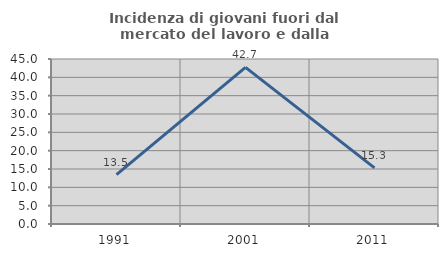
| Category | Incidenza di giovani fuori dal mercato del lavoro e dalla formazione  |
|---|---|
| 1991.0 | 13.462 |
| 2001.0 | 42.727 |
| 2011.0 | 15.306 |